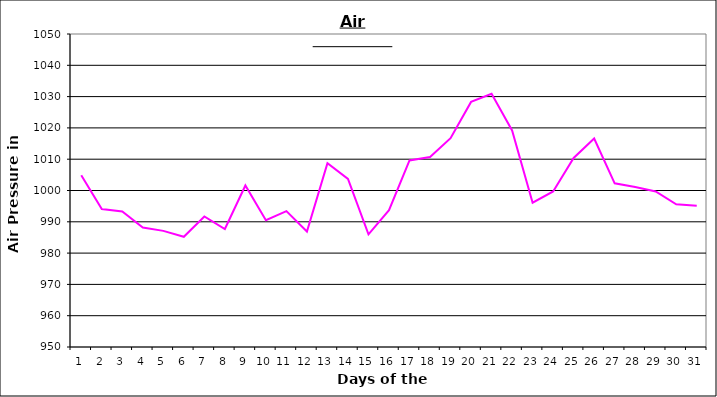
| Category | Series 0 |
|---|---|
| 0 | 1004.9 |
| 1 | 994.1 |
| 2 | 993.3 |
| 3 | 988.2 |
| 4 | 987.1 |
| 5 | 985.2 |
| 6 | 991.7 |
| 7 | 987.7 |
| 8 | 1001.6 |
| 9 | 990.5 |
| 10 | 993.4 |
| 11 | 986.9 |
| 12 | 1008.7 |
| 13 | 1003.7 |
| 14 | 986 |
| 15 | 993.7 |
| 16 | 1009.6 |
| 17 | 1010.7 |
| 18 | 1016.7 |
| 19 | 1028.3 |
| 20 | 1030.9 |
| 21 | 1019.2 |
| 22 | 996.1 |
| 23 | 999.7 |
| 24 | 1010.4 |
| 25 | 1016.6 |
| 26 | 1002.3 |
| 27 | 1001.1 |
| 28 | 999.7 |
| 29 | 995.6 |
| 30 | 995.1 |